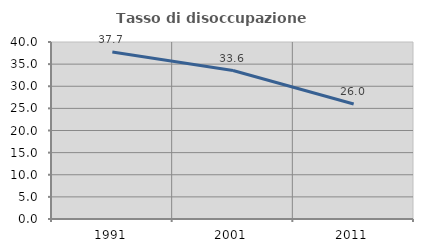
| Category | Tasso di disoccupazione giovanile  |
|---|---|
| 1991.0 | 37.725 |
| 2001.0 | 33.557 |
| 2011.0 | 26 |